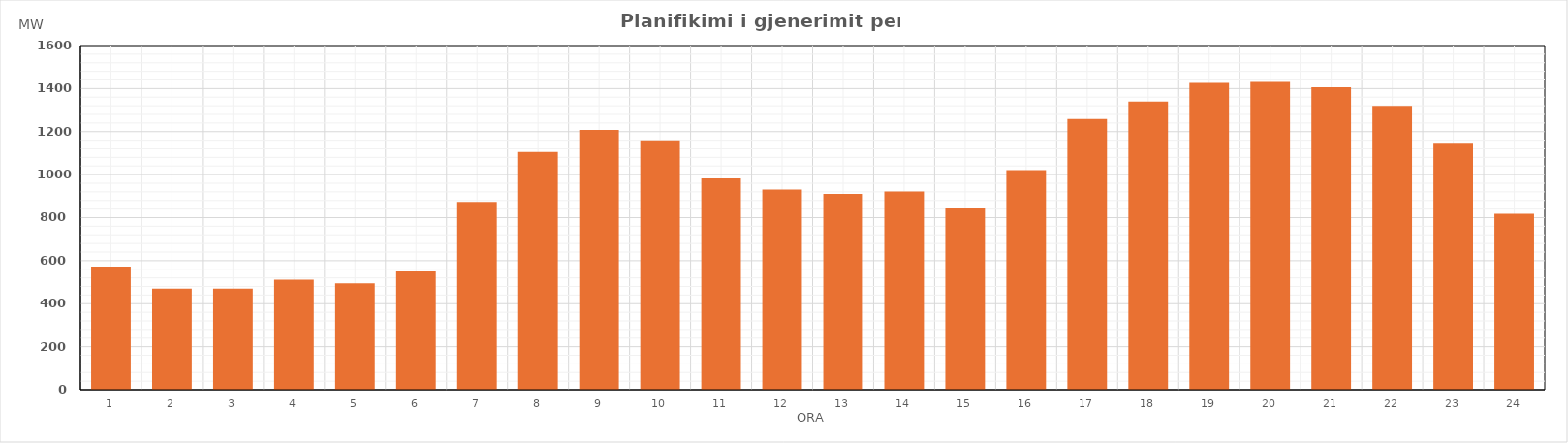
| Category | Max (MW) |
|---|---|
| 0 | 572.48 |
| 1 | 469.54 |
| 2 | 469.94 |
| 3 | 512.03 |
| 4 | 494.82 |
| 5 | 549.91 |
| 6 | 873.8 |
| 7 | 1105.18 |
| 8 | 1208.39 |
| 9 | 1159.13 |
| 10 | 982.22 |
| 11 | 930.76 |
| 12 | 910.55 |
| 13 | 922.04 |
| 14 | 842.28 |
| 15 | 1020.91 |
| 16 | 1258.78 |
| 17 | 1340.07 |
| 18 | 1426.2 |
| 19 | 1431.5 |
| 20 | 1405.98 |
| 21 | 1319.59 |
| 22 | 1143.97 |
| 23 | 817.51 |